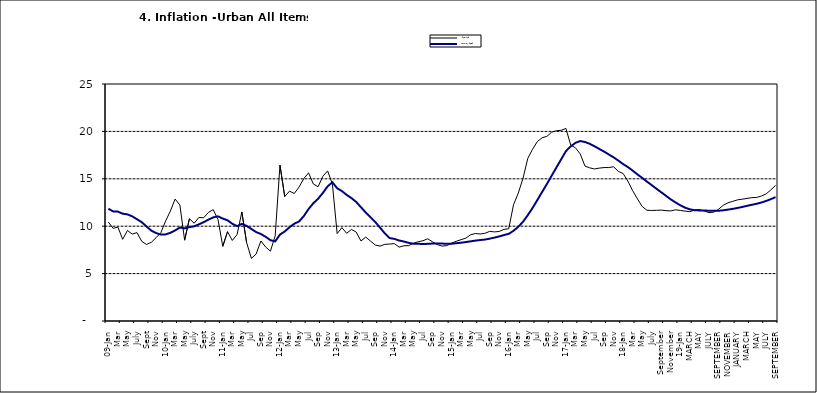
| Category | Year-on Rate | 12-Month Average |
|---|---|---|
| 09-Jan | 10.439 | 11.844 |
| Feb | 9.772 | 11.562 |
| Mar | 9.907 | 11.538 |
| Apr | 8.618 | 11.319 |
| May | 9.547 | 11.246 |
| June | 9.17 | 11.039 |
| July | 9.325 | 10.738 |
| Aug | 8.401 | 10.424 |
| Sept | 8.07 | 9.973 |
| Oct | 8.3 | 9.535 |
| Nov | 8.781 | 9.278 |
| Dec | 9.298 | 9.117 |
| 10-Jan | 10.534 | 9.136 |
| Feb | 11.584 | 9.297 |
| Mar | 12.864 | 9.555 |
| Apr | 12.24 | 9.859 |
| May | 8.524 | 9.769 |
| June | 10.781 | 9.904 |
| July | 10.313 | 9.987 |
| Aug | 10.924 | 10.197 |
| Sept | 10.891 | 10.43 |
| Oct | 11.457 | 10.689 |
| Nov | 11.748 | 10.932 |
| Dec | 10.699 | 11.042 |
| 11-Jan | 7.878 | 10.806 |
| Feb | 9.426 | 10.623 |
| Mar | 8.498 | 10.26 |
| Apr | 9.11 | 10.005 |
| May | 11.5 | 10.249 |
| Jun | 8.278 | 10.034 |
| Jul | 6.608 | 9.711 |
| Aug | 7.061 | 9.38 |
| Sep | 8.443 | 9.178 |
| Oct | 7.802 | 8.88 |
| Nov | 7.365 | 8.525 |
| Dec | 8.993 | 8.395 |
| 12-Jan | 16.445 | 9.119 |
| Feb | 13.123 | 9.443 |
| Mar | 13.701 | 9.889 |
| Apr | 13.447 | 10.259 |
| May | 14.127 | 10.496 |
| Jun | 15.012 | 11.062 |
| Jul | 15.63 | 11.81 |
| Aug | 14.456 | 12.422 |
| Sep | 14.162 | 12.893 |
| Oct | 15.26 | 13.506 |
| Nov | 15.836 | 14.199 |
| Dec | 14.459 | 14.637 |
| 13-Jan | 9.22 | 14.006 |
| Feb | 9.85 | 13.703 |
| Mar | 9.253 | 13.302 |
| Apr | 9.657 | 12.966 |
| May | 9.385 | 12.557 |
| Jun | 8.441 | 11.999 |
| Jul | 8.849 | 11.443 |
| Aug | 8.431 | 10.946 |
| Sep | 8.013 | 10.44 |
| Oct | 7.9 | 9.849 |
| Nov | 8.086 | 9.245 |
| Dec | 8.117 | 8.75 |
| 14-Jan | 8.164 | 8.662 |
| Feb | 7.791 | 8.493 |
| Mar | 7.937 | 8.384 |
| Apr | 7.947 | 8.246 |
| May | 8.195 | 8.151 |
| Jun | 8.358 | 8.146 |
| Jul | 8.464 | 8.118 |
| Aug | 8.673 | 8.141 |
| Sep | 8.357 | 8.17 |
| Oct | 8.064 | 8.182 |
| Nov | 7.902 | 8.165 |
| Dec | 7.948 | 8.151 |
| 15-Jan | 8.211 | 8.155 |
| Feb | 8.412 | 8.206 |
| Mar | 8.579 | 8.26 |
| Apr | 8.742 | 8.326 |
| May | 9.092 | 8.403 |
| Jun | 9.232 | 8.478 |
| Jul | 9.177 | 8.54 |
| Aug | 9.25 | 8.591 |
| Sep | 9.455 | 8.684 |
| Oct | 9.398 | 8.795 |
| Nov | 9.442 | 8.922 |
| Dec | 9.665 | 9.064 |
| 16-Jan | 9.728 | 9.19 |
| Feb | 12.254 | 9.516 |
| Mar | 13.485 | 9.935 |
| Apr | 15.052 | 10.474 |
| May | 17.148 | 11.165 |
| Jun | 18.111 | 11.925 |
| Jul | 18.927 | 12.754 |
| Aug | 19.325 | 13.605 |
| Sep | 19.476 | 14.444 |
| Oct | 19.914 | 15.318 |
| Nov | 20.067 | 16.193 |
| Dec | 20.118 | 17.05 |
| 17-Jan | 20.315 | 17.914 |
| Feb | 18.569 | 18.418 |
| Mar | 18.27 | 18.794 |
| Apr | 17.621 | 18.982 |
| May | 16.343 | 18.883 |
| Jun | 16.153 | 18.692 |
| Jul | 16.038 | 18.43 |
| Aug | 16.128 | 18.151 |
| Sep | 16.183 | 17.872 |
| Oct | 16.187 | 17.567 |
| Nov | 16.267 | 17.264 |
| Dec | 15.785 | 16.921 |
| 18-Jan | 15.559 | 16.55 |
| Feb | 14.763 | 16.241 |
| Mar | 13.748 | 15.866 |
| Apr | 12.893 | 15.468 |
| May | 12.077 | 15.096 |
| June | 11.683 | 14.706 |
| July | 11.661 | 14.329 |
| August | 11.673 | 13.951 |
| September | 11.697 | 13.578 |
| October | 11.64 | 13.206 |
| November | 11.615 | 12.831 |
| December | 11.731 | 12.509 |
| 19-Jan | 11.664 | 12.203 |
| February | 11.592 | 11.954 |
| MARCH | 11.535 | 11.78 |
| APRIL | 11.696 | 11.686 |
| MAY | 11.756 | 11.662 |
| JUNE | 11.605 | 11.655 |
| JULY | 11.432 | 11.635 |
| AUGUST | 11.479 | 11.618 |
| SEPTEMBER | 11.776 | 11.626 |
| OCTOBER | 12.202 | 11.676 |
| NOVEMBER | 12.469 | 11.75 |
| DECEMBER | 12.617 | 11.827 |
| JANUARY | 12.779 | 11.923 |
| FEBRUARY | 12.847 | 12.03 |
| MARCH | 12.932 | 12.147 |
| APRIL | 13.008 | 12.258 |
| MAY | 13.033 | 12.365 |
| JUNE | 13.178 | 12.496 |
| JULY | 13.403 | 12.659 |
| AUGUST | 13.827 | 12.855 |
| SEPTEMBER | 14.306 | 13.068 |